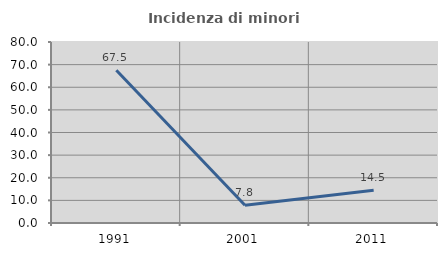
| Category | Incidenza di minori stranieri |
|---|---|
| 1991.0 | 67.5 |
| 2001.0 | 7.812 |
| 2011.0 | 14.478 |